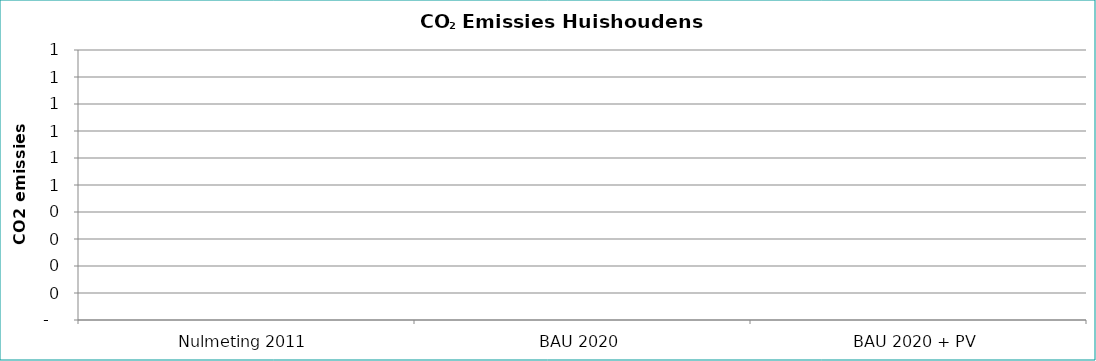
| Category | Series 0 |
|---|---|
| Nulmeting 2011 | 0 |
| BAU 2020 | 0 |
| BAU 2020 + PV | 0 |